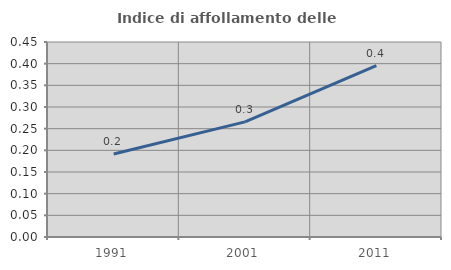
| Category | Indice di affollamento delle abitazioni  |
|---|---|
| 1991.0 | 0.191 |
| 2001.0 | 0.266 |
| 2011.0 | 0.395 |